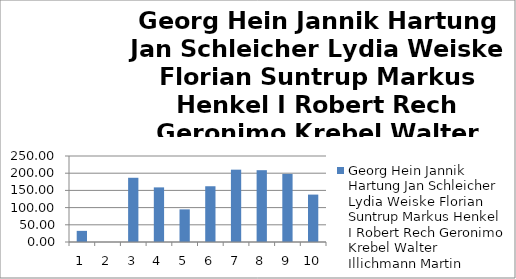
| Category | Georg Hein Jannik Hartung Jan Schleicher Lydia Weiske Florian Suntrup Markus Henkel I Robert Rech Geronimo Krebel Walter Illichmann Martin Schulta |
|---|---|
| 0 | 32.37 |
| 1 | 0 |
| 2 | 186.7 |
| 3 | 158.76 |
| 4 | 94.86 |
| 5 | 162.09 |
| 6 | 210.28 |
| 7 | 208.75 |
| 8 | 197.93 |
| 9 | 137.82 |